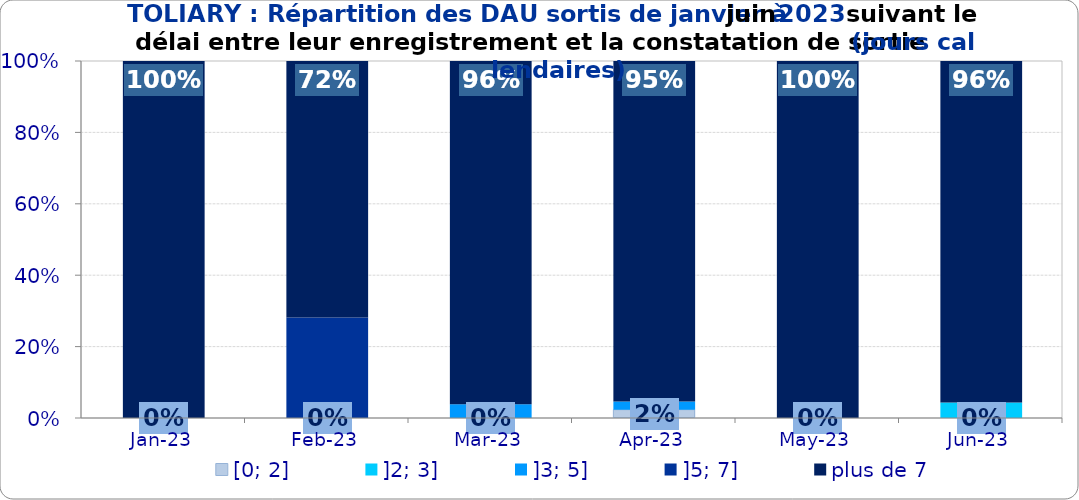
| Category | [0; 2] | ]2; 3] | ]3; 5] | ]5; 7] | plus de 7 |
|---|---|---|---|---|---|
| 2023-01-01 | 0 | 0 | 0 | 0 | 1 |
| 2023-02-01 | 0 | 0 | 0 | 0.281 | 0.719 |
| 2023-03-01 | 0 | 0 | 0.038 | 0 | 0.962 |
| 2023-04-01 | 0.023 | 0 | 0.023 | 0 | 0.953 |
| 2023-05-01 | 0 | 0 | 0 | 0 | 1 |
| 2023-06-01 | 0 | 0.043 | 0 | 0 | 0.957 |